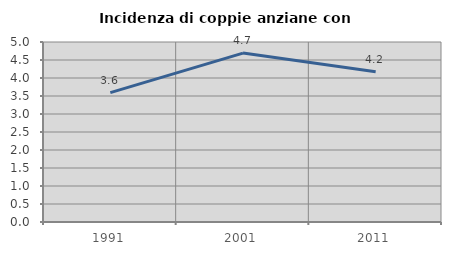
| Category | Incidenza di coppie anziane con figli |
|---|---|
| 1991.0 | 3.594 |
| 2001.0 | 4.692 |
| 2011.0 | 4.175 |